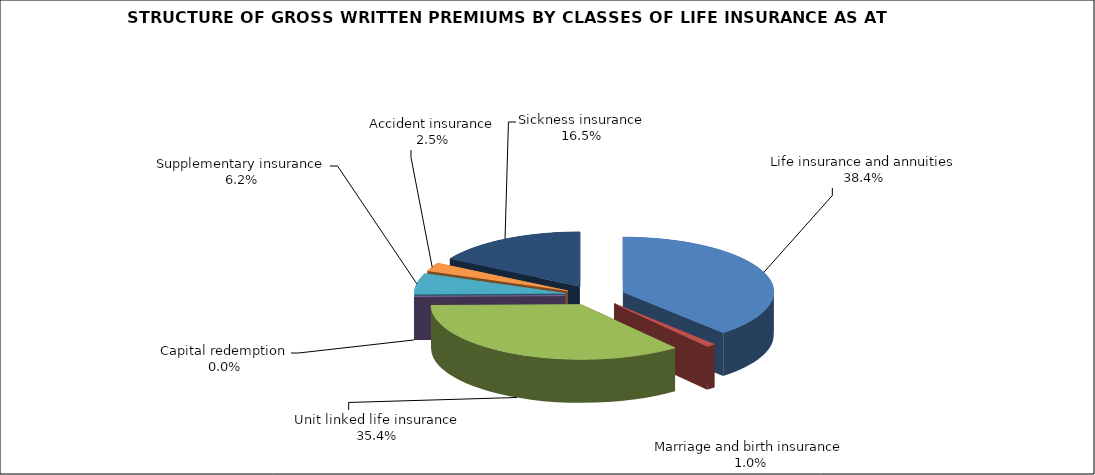
| Category | Life insurance and annuities |
|---|---|
| Life insurance and annuities | 240256029.75 |
| Marriage and birth insurance | 6186766.636 |
| Unit linked life insurance | 221133426.206 |
| Capital redemption | 0 |
| Supplementary insurance | 38686083.789 |
| Accident insurance | 15693504.97 |
| Sickness insurance | 103434310.2 |